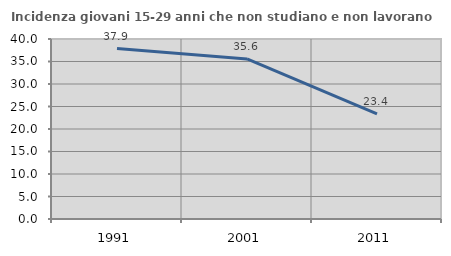
| Category | Incidenza giovani 15-29 anni che non studiano e non lavorano  |
|---|---|
| 1991.0 | 37.879 |
| 2001.0 | 35.572 |
| 2011.0 | 23.37 |